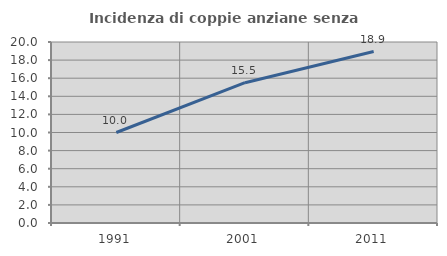
| Category | Incidenza di coppie anziane senza figli  |
|---|---|
| 1991.0 | 10 |
| 2001.0 | 15.505 |
| 2011.0 | 18.942 |